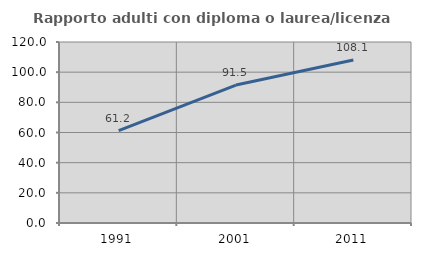
| Category | Rapporto adulti con diploma o laurea/licenza media  |
|---|---|
| 1991.0 | 61.224 |
| 2001.0 | 91.463 |
| 2011.0 | 108.061 |